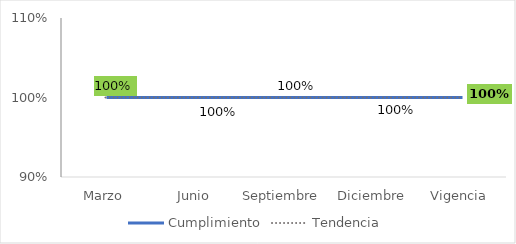
| Category | Cumplimiento |
|---|---|
| Marzo | 1 |
| Junio | 1 |
| Septiembre | 1 |
| Diciembre | 1 |
| Vigencia | 1 |